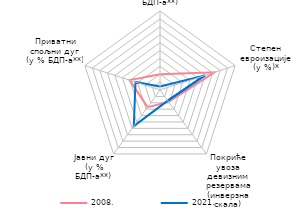
| Category | 2008. | 2021. |
|---|---|---|
| Текући дефицит платног биланса
(у % БДП-a**) | 20 | 4.4 |
| Степен
евроизације
(у %)* | 72.4 | 59.73 |
| Покриће увоза девизним резервама
(инверзна скала) | 18.651 | 16.7 |
| Јавни дуг
(у % БДП-a**) | 26.8 | 56.5 |
| Приватни
спољни дуг
(у % БДП-a**) | 40.4 | 32.6 |